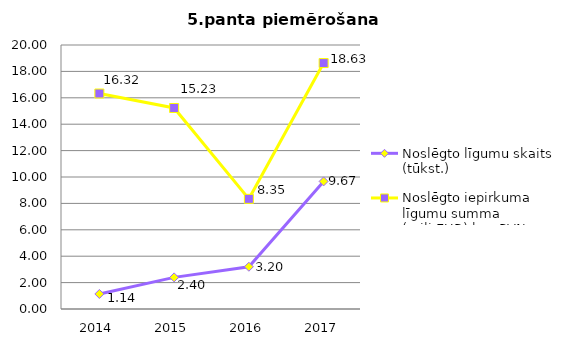
| Category | Noslēgto līgumu skaits (tūkst.) | Noslēgto iepirkuma līgumu summa (milj.EUR) bez PVN |
|---|---|---|
| 2014.0 | 1.139 | 16.325 |
| 2015.0 | 2.395 | 15.229 |
| 2016.0 | 3.201 | 8.346 |
| 2017.0 | 9.667 | 18.632 |